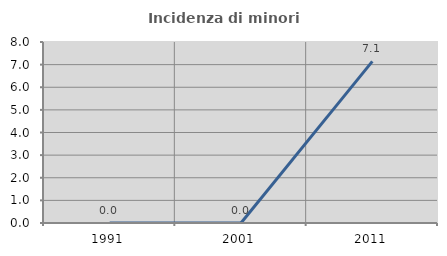
| Category | Incidenza di minori stranieri |
|---|---|
| 1991.0 | 0 |
| 2001.0 | 0 |
| 2011.0 | 7.143 |